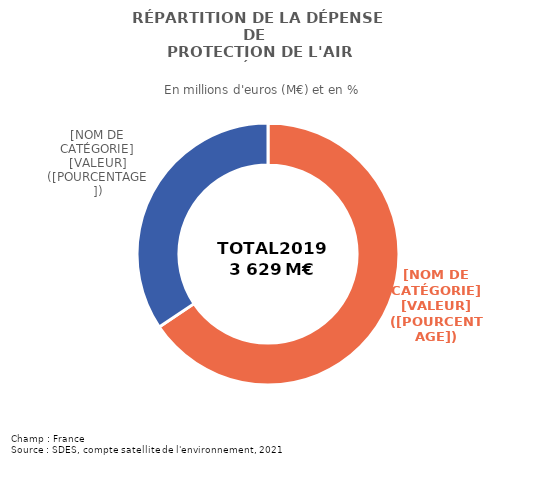
| Category | Series 0 |
|---|---|
| Dépenses courantes | 2380.624 |
| Dépenses d'investissement | 1248.584 |